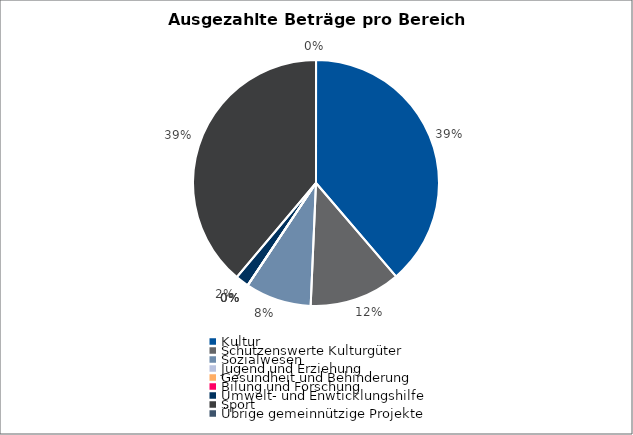
| Category | Series 0 |
|---|---|
| Kultur | 5479491 |
| Schützenswerte Kulturgüter | 1691736 |
| Sozialwesen | 1227306 |
| Jugend und Erziehung | 0 |
| Gesundheit und Behinderung | 0 |
| Bilung und Forschung | 0 |
| Umwelt- und Enwticklungshilfe | 249108 |
| Sport | 5499175 |
| Übrige gemeinnützige Projekte | 0 |